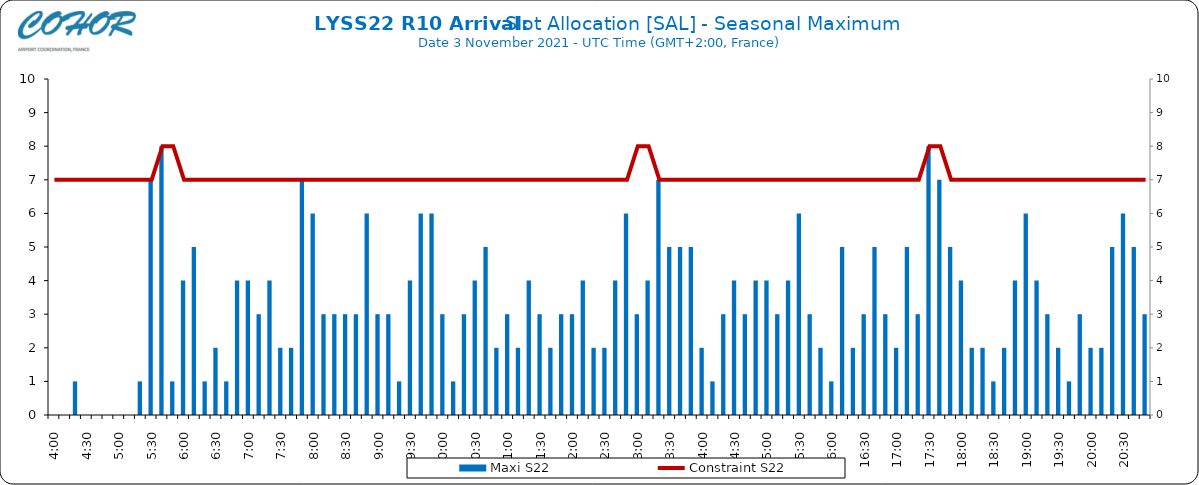
| Category | Maxi S22 |
|---|---|
| 0.16666666666666666 | 0 |
| 0.17361111111111113 | 0 |
| 0.18055555555555555 | 1 |
| 0.1875 | 0 |
| 0.19444444444444445 | 0 |
| 0.20138888888888887 | 0 |
| 0.20833333333333334 | 0 |
| 0.2152777777777778 | 0 |
| 0.2222222222222222 | 1 |
| 0.22916666666666666 | 7 |
| 0.23611111111111113 | 8 |
| 0.24305555555555555 | 1 |
| 0.25 | 4 |
| 0.2569444444444445 | 5 |
| 0.2638888888888889 | 1 |
| 0.2708333333333333 | 2 |
| 0.2777777777777778 | 1 |
| 0.2847222222222222 | 4 |
| 0.2916666666666667 | 4 |
| 0.2986111111111111 | 3 |
| 0.3055555555555555 | 4 |
| 0.3125 | 2 |
| 0.3194444444444445 | 2 |
| 0.3263888888888889 | 7 |
| 0.3333333333333333 | 6 |
| 0.34027777777777773 | 3 |
| 0.34722222222222227 | 3 |
| 0.3541666666666667 | 3 |
| 0.3611111111111111 | 3 |
| 0.3680555555555556 | 6 |
| 0.375 | 3 |
| 0.3819444444444444 | 3 |
| 0.3888888888888889 | 1 |
| 0.3958333333333333 | 4 |
| 0.40277777777777773 | 6 |
| 0.40972222222222227 | 6 |
| 0.4166666666666667 | 3 |
| 0.4236111111111111 | 1 |
| 0.4305555555555556 | 3 |
| 0.4375 | 4 |
| 0.4444444444444444 | 5 |
| 0.4513888888888889 | 2 |
| 0.4583333333333333 | 3 |
| 0.46527777777777773 | 2 |
| 0.47222222222222227 | 4 |
| 0.4791666666666667 | 3 |
| 0.4861111111111111 | 2 |
| 0.4930555555555556 | 3 |
| 0.5 | 3 |
| 0.5069444444444444 | 4 |
| 0.513888888888889 | 2 |
| 0.5208333333333334 | 2 |
| 0.5277777777777778 | 4 |
| 0.5347222222222222 | 6 |
| 0.5416666666666666 | 3 |
| 0.548611111111111 | 4 |
| 0.5555555555555556 | 7 |
| 0.5625 | 5 |
| 0.5694444444444444 | 5 |
| 0.576388888888889 | 5 |
| 0.5833333333333334 | 2 |
| 0.5902777777777778 | 1 |
| 0.5972222222222222 | 3 |
| 0.6041666666666666 | 4 |
| 0.611111111111111 | 3 |
| 0.6180555555555556 | 4 |
| 0.625 | 4 |
| 0.6319444444444444 | 3 |
| 0.638888888888889 | 4 |
| 0.6458333333333334 | 6 |
| 0.6527777777777778 | 3 |
| 0.6597222222222222 | 2 |
| 0.6666666666666666 | 1 |
| 0.6736111111111112 | 5 |
| 0.6805555555555555 | 2 |
| 0.6875 | 3 |
| 0.6944444444444445 | 5 |
| 0.7013888888888888 | 3 |
| 0.7083333333333334 | 2 |
| 0.7152777777777778 | 5 |
| 0.7222222222222222 | 3 |
| 0.7291666666666666 | 8 |
| 0.7361111111111112 | 7 |
| 0.7430555555555555 | 5 |
| 0.75 | 4 |
| 0.7569444444444445 | 2 |
| 0.7638888888888888 | 2 |
| 0.7708333333333334 | 1 |
| 0.7777777777777778 | 2 |
| 0.7847222222222222 | 4 |
| 0.7916666666666666 | 6 |
| 0.7986111111111112 | 4 |
| 0.8055555555555555 | 3 |
| 0.8125 | 2 |
| 0.8194444444444445 | 1 |
| 0.8263888888888888 | 3 |
| 0.8333333333333334 | 2 |
| 0.8402777777777778 | 2 |
| 0.8472222222222222 | 5 |
| 0.8541666666666666 | 6 |
| 0.8611111111111112 | 5 |
| 0.8680555555555555 | 3 |